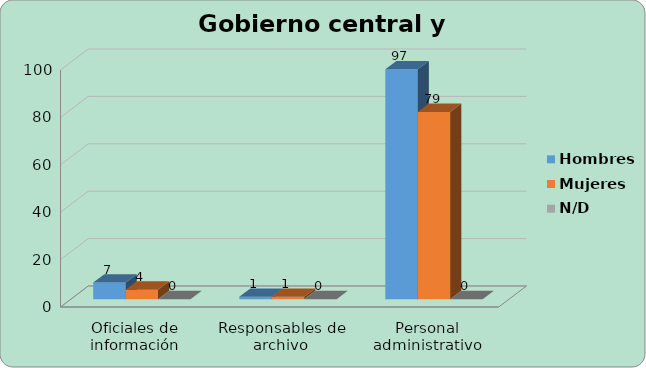
| Category | Hombres | Mujeres | N/D |
|---|---|---|---|
| Oficiales de información | 7 | 4 | 0 |
| Responsables de archivo | 1 | 1 | 0 |
| Personal administrativo | 97 | 79 | 0 |